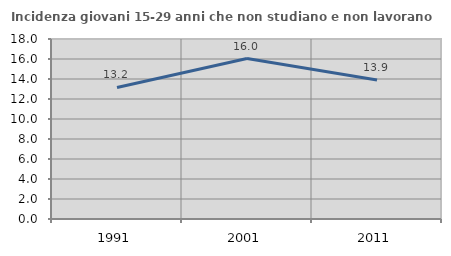
| Category | Incidenza giovani 15-29 anni che non studiano e non lavorano  |
|---|---|
| 1991.0 | 13.158 |
| 2001.0 | 16.049 |
| 2011.0 | 13.905 |